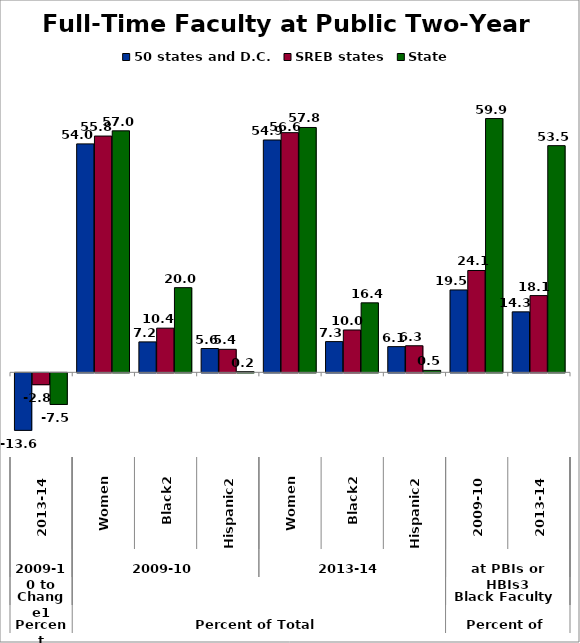
| Category | 50 states and D.C. | SREB states | State |
|---|---|---|---|
| 0 | -13.585 | -2.8 | -7.466 |
| 1 | 53.965 | 55.815 | 57.045 |
| 2 | 7.19 | 10.433 | 20 |
| 3 | 5.623 | 5.437 | 0.159 |
| 4 | 54.884 | 56.619 | 57.841 |
| 5 | 7.259 | 10.004 | 16.414 |
| 6 | 6.069 | 6.279 | 0.466 |
| 7 | 19.466 | 24.055 | 59.947 |
| 8 | 14.282 | 18.124 | 53.546 |